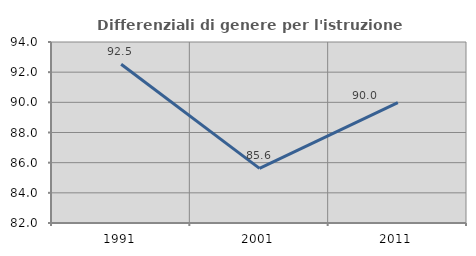
| Category | Differenziali di genere per l'istruzione superiore |
|---|---|
| 1991.0 | 92.528 |
| 2001.0 | 85.623 |
| 2011.0 | 89.976 |